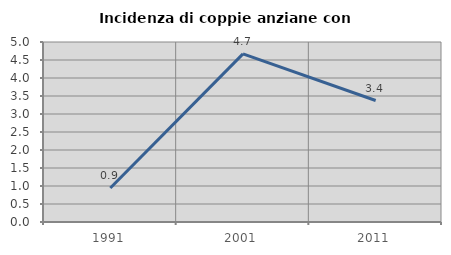
| Category | Incidenza di coppie anziane con figli |
|---|---|
| 1991.0 | 0.943 |
| 2001.0 | 4.669 |
| 2011.0 | 3.375 |